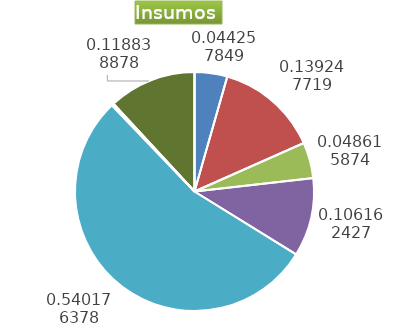
| Category | Series 0 |
|---|---|
| Control arvenses | 487842 |
| Control fitosanitario | 1534889 |
| Cosecha y beneficio | 535879.3 |
| Fertilización | 1170199 |
| Instalación | 5954214.441 |
| Otros | 29771 |
| Podas | 0 |
| Riego | 0 |
| Transporte | 1309928 |
| Tutorado | 0 |